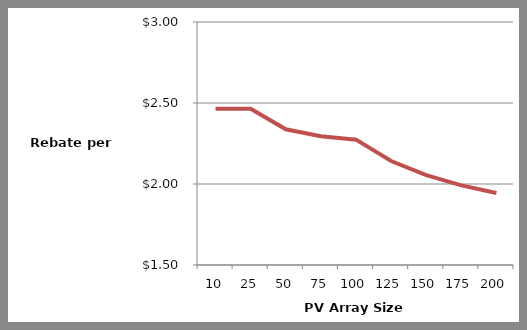
| Category | Series 1 |
|---|---|
| 10.0 | 2.465 |
| 25.0 | 2.465 |
| 50.0 | 2.338 |
| 75.0 | 2.295 |
| 100.0 | 2.274 |
| 125.0 | 2.142 |
| 150.0 | 2.054 |
| 175.0 | 1.991 |
| 200.0 | 1.944 |